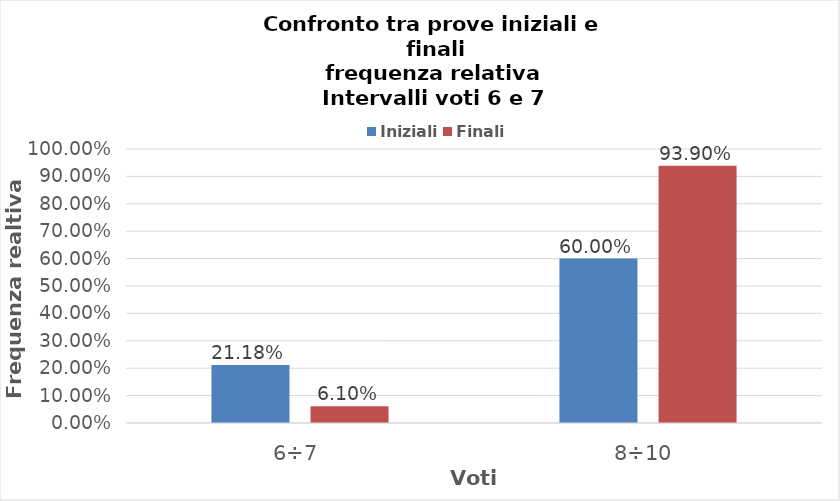
| Category | Iniziali | Finali |
|---|---|---|
| 6÷7 | 0.212 | 0.061 |
| 8÷10 | 0.6 | 0.939 |